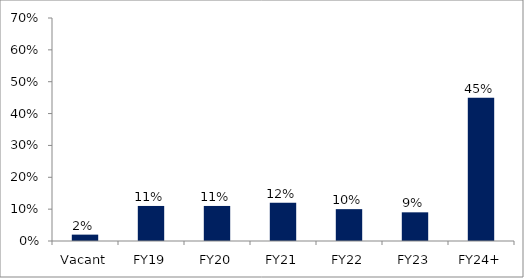
| Category | Series 0 |
|---|---|
| Vacant | 0.02 |
| FY19 | 0.11 |
| FY20 | 0.11 |
| FY21 | 0.12 |
| FY22 | 0.1 |
| FY23 | 0.09 |
| FY24+ | 0.45 |